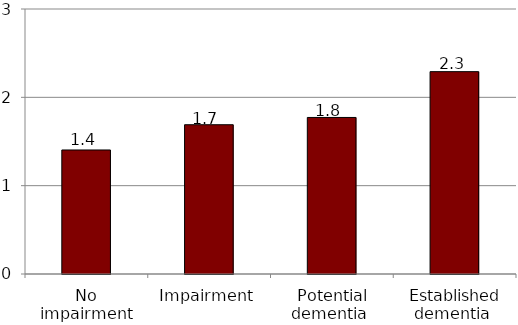
| Category | Average number of caregivers  |
|---|---|
| No impairment | 1.404 |
| Impairment | 1.69 |
| Potential dementia  | 1.772 |
| Established dementia  | 2.291 |